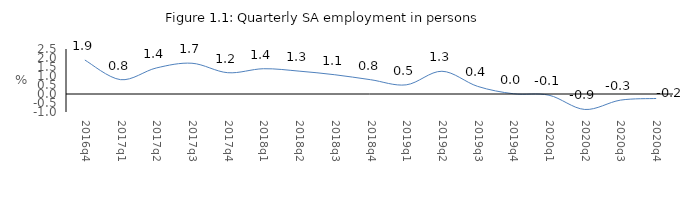
| Category | Series 0 |
|---|---|
| 2016q4 | 1.887 |
| 2017q1 | 0.796 |
| 2017q2 | 1.446 |
| 2017q3 | 1.709 |
| 2017q4 | 1.183 |
| 2018q1 | 1.404 |
| 2018q2 | 1.271 |
| 2018q3 | 1.07 |
| 2018q4 | 0.795 |
| 2019q1 | 0.508 |
| 2019q2 | 1.264 |
| 2019q3 | 0.424 |
| 2019q4 | 0.014 |
| 2020q1 | -0.067 |
| 2020q2 | -0.859 |
| 2020q3 | -0.341 |
| 2020q4 | -0.249 |